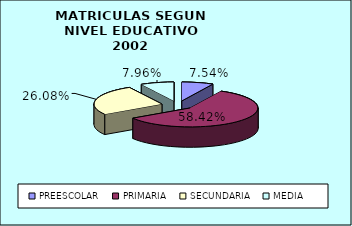
| Category | MATRICULAS | % |
|---|---|---|
| PREESCOLAR | 18645 | 6.361 |
| PRIMARIA | 144391 | 49.258 |
| SECUNDARIA | 64466 | 21.992 |
| MEDIA | 19671 | 6.711 |